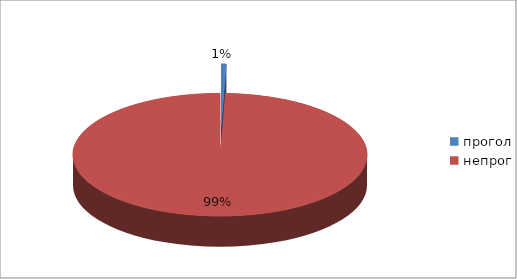
| Category | Series 0 |
|---|---|
| прогол | 6 |
| непрог | 1072 |